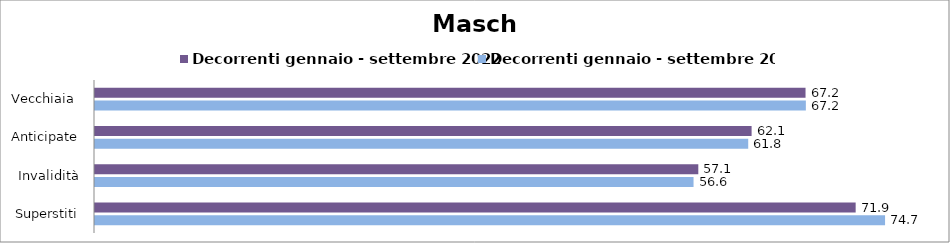
| Category | Decorrenti gennaio - settembre 2022 | Decorrenti gennaio - settembre 2023 |
|---|---|---|
| Vecchiaia  | 67.19 | 67.22 |
| Anticipate | 62.09 | 61.77 |
| Invalidità | 57.05 | 56.6 |
| Superstiti | 71.93 | 74.71 |